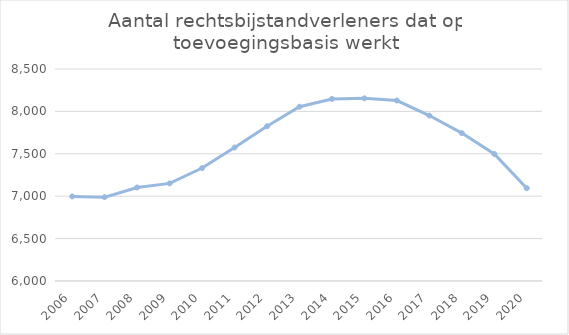
| Category | Aantal |
|---|---|
| 2006.0 | 6997 |
| 2007.0 | 6989 |
| 2008.0 | 7103 |
| 2009.0 | 7151 |
| 2010.0 | 7332 |
| 2011.0 | 7574 |
| 2012.0 | 7825 |
| 2013.0 | 8055 |
| 2014.0 | 8147 |
| 2015.0 | 8154 |
| 2016.0 | 8128 |
| 2017.0 | 7951 |
| 2018.0 | 7744 |
| 2019.0 | 7498 |
| 2020.0 | 7094 |